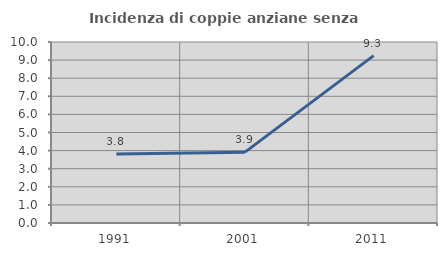
| Category | Incidenza di coppie anziane senza figli  |
|---|---|
| 1991.0 | 3.806 |
| 2001.0 | 3.916 |
| 2011.0 | 9.25 |